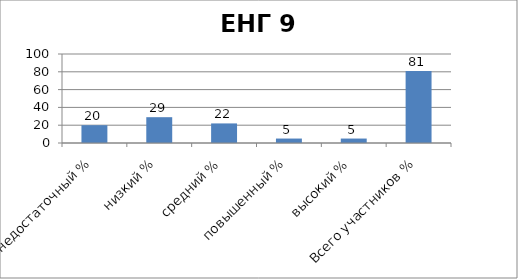
| Category | Series 0 |
|---|---|
| недостаточный % | 20 |
| низкий % | 29 |
| средний % | 22 |
| повышенный % | 5 |
| высокий % | 5 |
| Всего участников % | 81 |